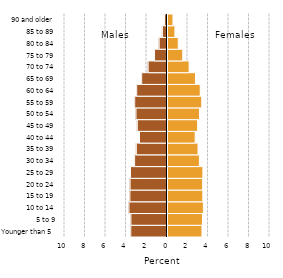
| Category | Female |
|---|---|
| Younger than 5 | 3.361 |
| 5 to 9 | 3.412 |
| 10 to 14 | 3.5 |
| 15 to 19 | 3.447 |
| 20 to 24 | 3.43 |
| 25 to 29 | 3.453 |
| 30 to 34 | 3.11 |
| 35 to 39 | 2.977 |
| 40 to 44 | 2.699 |
| 45 to 49 | 2.941 |
| 50 to 54 | 3.12 |
| 55 to 59 | 3.34 |
| 60 to 64 | 3.195 |
| 65 to 69 | 2.731 |
| 70 to 74 | 2.108 |
| 75 to 79 | 1.485 |
| 80 to 84 | 1.048 |
| 85 to 89 | 0.721 |
| 90 and older | 0.533 |